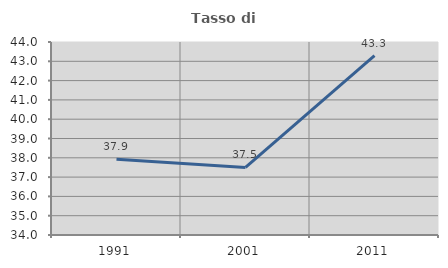
| Category | Tasso di occupazione   |
|---|---|
| 1991.0 | 37.929 |
| 2001.0 | 37.5 |
| 2011.0 | 43.29 |